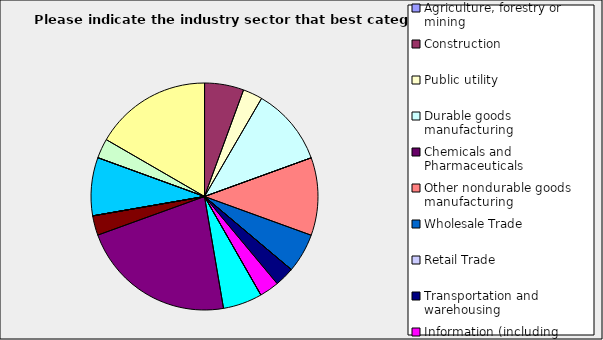
| Category | Series 0 |
|---|---|
| Agriculture, forestry or mining | 0 |
| Construction | 0.056 |
| Public utility | 0.028 |
| Durable goods manufacturing | 0.111 |
| Chemicals and Pharmaceuticals | 0 |
| Other nondurable goods manufacturing | 0.111 |
| Wholesale Trade | 0.056 |
| Retail Trade | 0 |
| Transportation and warehousing | 0.028 |
| Information (including broadcasting and telecommunication) | 0.028 |
| Finance and Insurance | 0 |
| Real Estate | 0.056 |
| Professional, scientific and technical services | 0.222 |
| Consulting | 0.028 |
| Administrative and office services (including waste management) | 0 |
| Education | 0 |
| Health Care and social services | 0.083 |
| Arts, entertainment and recreation | 0 |
| Accommodation and food services | 0.028 |
| Other | 0.167 |